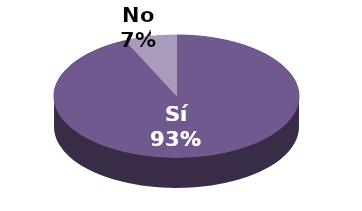
| Category | Series 1 |
|---|---|
| Sí | 27 |
| No | 2 |